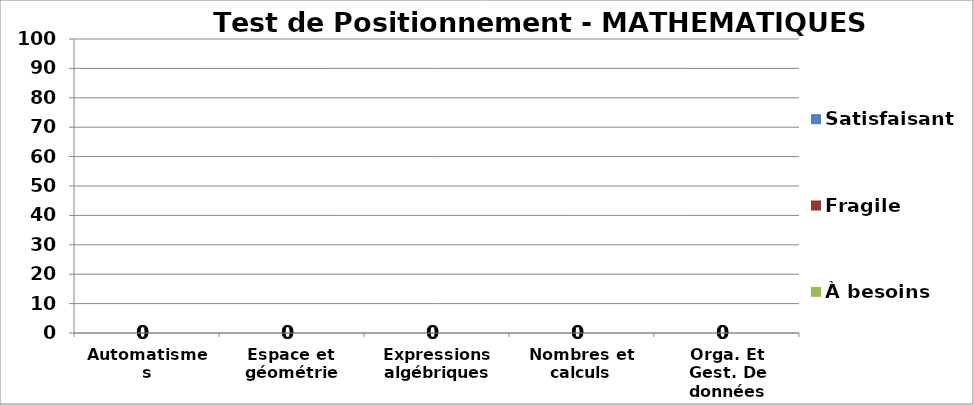
| Category | À besoins | Fragile | Satisfaisant |
|---|---|---|---|
| Automatismes | 0 | 0 | 0 |
| Espace et géométrie | 0 | 0 | 0 |
| Expressions algébriques | 0 | 0 | 0 |
| Nombres et calculs | 0 | 0 | 0 |
| Orga. Et Gest. De données | 0 | 0 | 0 |